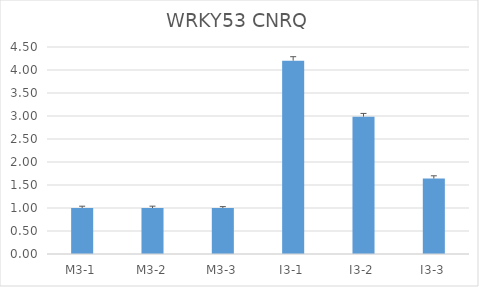
| Category | WRKY53 CNRQ |
|---|---|
| M3-1 | 1 |
| M3-2 | 1 |
| M3-3 | 1 |
| I3-1 | 4.203 |
| I3-2 | 2.986 |
| I3-3 | 1.64 |